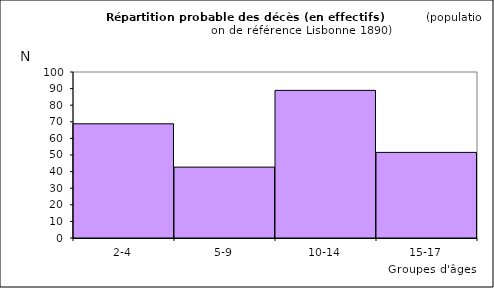
| Category | Series 0 |
|---|---|
| 2-4 | 68.791 |
| 5-9 | 42.701 |
| 10-14 | 88.94 |
| 15-17 | 51.569 |